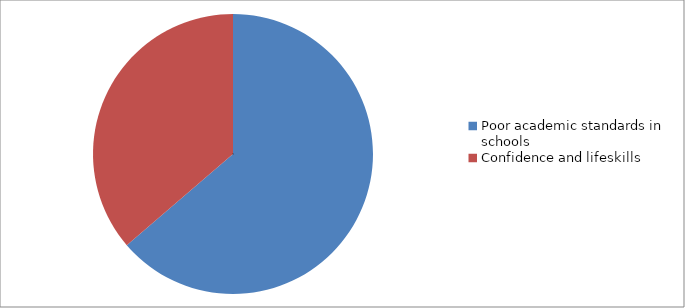
| Category | Series 0 |
|---|---|
| Poor academic standards in schools | 79 |
| Confidence and lifeskills | 45 |